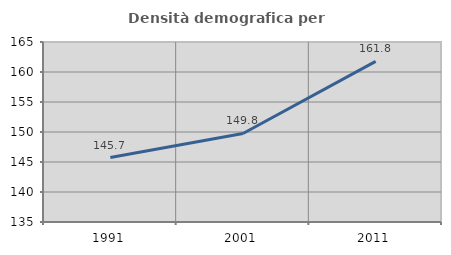
| Category | Densità demografica |
|---|---|
| 1991.0 | 145.736 |
| 2001.0 | 149.754 |
| 2011.0 | 161.763 |